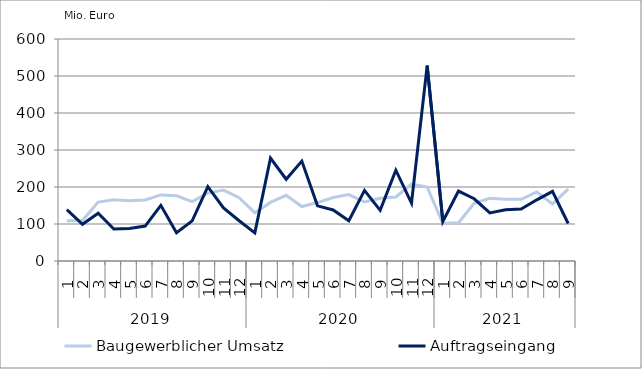
| Category | Baugewerblicher Umsatz | Auftragseingang |
|---|---|---|
| 0 | 108616.605 | 139065.287 |
| 1 | 109331.58 | 99318.609 |
| 2 | 159117.81 | 129002.041 |
| 3 | 165654.287 | 86579.2 |
| 4 | 162976.056 | 87644.362 |
| 5 | 165026.188 | 94463.186 |
| 6 | 178622.938 | 150345.08 |
| 7 | 176074.101 | 76434.317 |
| 8 | 160663.041 | 108444.162 |
| 9 | 183589.485 | 201122.697 |
| 10 | 191777.213 | 143514.792 |
| 11 | 170885.223 | 108780.022 |
| 12 | 130445.562 | 75891.481 |
| 13 | 158433.655 | 277923.85 |
| 14 | 177529.832 | 220973.626 |
| 15 | 147259.799 | 269936.091 |
| 16 | 157965.891 | 149072.895 |
| 17 | 171647.778 | 137984.76 |
| 18 | 179530.732 | 108645.965 |
| 19 | 159480.457 | 190771.468 |
| 20 | 169638.111 | 136988.906 |
| 21 | 173040.053 | 245341.603 |
| 22 | 207619.085 | 156647.224 |
| 23 | 199947.086 | 528166.004 |
| 24 | 101295.895 | 106850.127 |
| 25 | 103236.543 | 188883.434 |
| 26 | 156172.725 | 168204.42 |
| 27 | 169257.088 | 130052.073 |
| 28 | 166897.821 | 138492.214 |
| 29 | 166720.216 | 140262.426 |
| 30 | 186515.191 | 165331.191 |
| 31 | 154188.941 | 188169.655 |
| 32 | 194464.12 | 101359.538 |